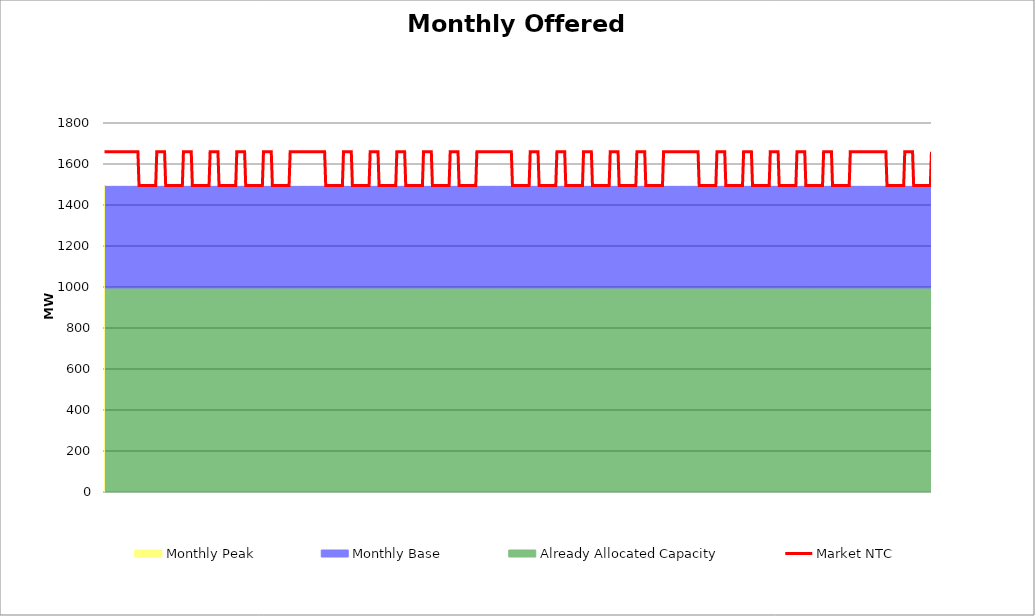
| Category | Market NTC |
|---|---|
| 0 | 1660 |
| 1 | 1660 |
| 2 | 1660 |
| 3 | 1660 |
| 4 | 1660 |
| 5 | 1660 |
| 6 | 1660 |
| 7 | 1660 |
| 8 | 1660 |
| 9 | 1660 |
| 10 | 1660 |
| 11 | 1660 |
| 12 | 1660 |
| 13 | 1660 |
| 14 | 1660 |
| 15 | 1660 |
| 16 | 1660 |
| 17 | 1660 |
| 18 | 1660 |
| 19 | 1660 |
| 20 | 1660 |
| 21 | 1660 |
| 22 | 1660 |
| 23 | 1660 |
| 24 | 1660 |
| 25 | 1660 |
| 26 | 1660 |
| 27 | 1660 |
| 28 | 1660 |
| 29 | 1660 |
| 30 | 1660 |
| 31 | 1495 |
| 32 | 1495 |
| 33 | 1495 |
| 34 | 1495 |
| 35 | 1495 |
| 36 | 1495 |
| 37 | 1495 |
| 38 | 1495 |
| 39 | 1495 |
| 40 | 1495 |
| 41 | 1495 |
| 42 | 1495 |
| 43 | 1495 |
| 44 | 1495 |
| 45 | 1495 |
| 46 | 1495 |
| 47 | 1660 |
| 48 | 1660 |
| 49 | 1660 |
| 50 | 1660 |
| 51 | 1660 |
| 52 | 1660 |
| 53 | 1660 |
| 54 | 1660 |
| 55 | 1495 |
| 56 | 1495 |
| 57 | 1495 |
| 58 | 1495 |
| 59 | 1495 |
| 60 | 1495 |
| 61 | 1495 |
| 62 | 1495 |
| 63 | 1495 |
| 64 | 1495 |
| 65 | 1495 |
| 66 | 1495 |
| 67 | 1495 |
| 68 | 1495 |
| 69 | 1495 |
| 70 | 1495 |
| 71 | 1660 |
| 72 | 1660 |
| 73 | 1660 |
| 74 | 1660 |
| 75 | 1660 |
| 76 | 1660 |
| 77 | 1660 |
| 78 | 1660 |
| 79 | 1495 |
| 80 | 1495 |
| 81 | 1495 |
| 82 | 1495 |
| 83 | 1495 |
| 84 | 1495 |
| 85 | 1495 |
| 86 | 1495 |
| 87 | 1495 |
| 88 | 1495 |
| 89 | 1495 |
| 90 | 1495 |
| 91 | 1495 |
| 92 | 1495 |
| 93 | 1495 |
| 94 | 1495 |
| 95 | 1660 |
| 96 | 1660 |
| 97 | 1660 |
| 98 | 1660 |
| 99 | 1660 |
| 100 | 1660 |
| 101 | 1660 |
| 102 | 1660 |
| 103 | 1495 |
| 104 | 1495 |
| 105 | 1495 |
| 106 | 1495 |
| 107 | 1495 |
| 108 | 1495 |
| 109 | 1495 |
| 110 | 1495 |
| 111 | 1495 |
| 112 | 1495 |
| 113 | 1495 |
| 114 | 1495 |
| 115 | 1495 |
| 116 | 1495 |
| 117 | 1495 |
| 118 | 1495 |
| 119 | 1660 |
| 120 | 1660 |
| 121 | 1660 |
| 122 | 1660 |
| 123 | 1660 |
| 124 | 1660 |
| 125 | 1660 |
| 126 | 1660 |
| 127 | 1495 |
| 128 | 1495 |
| 129 | 1495 |
| 130 | 1495 |
| 131 | 1495 |
| 132 | 1495 |
| 133 | 1495 |
| 134 | 1495 |
| 135 | 1495 |
| 136 | 1495 |
| 137 | 1495 |
| 138 | 1495 |
| 139 | 1495 |
| 140 | 1495 |
| 141 | 1495 |
| 142 | 1495 |
| 143 | 1660 |
| 144 | 1660 |
| 145 | 1660 |
| 146 | 1660 |
| 147 | 1660 |
| 148 | 1660 |
| 149 | 1660 |
| 150 | 1660 |
| 151 | 1495 |
| 152 | 1495 |
| 153 | 1495 |
| 154 | 1495 |
| 155 | 1495 |
| 156 | 1495 |
| 157 | 1495 |
| 158 | 1495 |
| 159 | 1495 |
| 160 | 1495 |
| 161 | 1495 |
| 162 | 1495 |
| 163 | 1495 |
| 164 | 1495 |
| 165 | 1495 |
| 166 | 1495 |
| 167 | 1660 |
| 168 | 1660 |
| 169 | 1660 |
| 170 | 1660 |
| 171 | 1660 |
| 172 | 1660 |
| 173 | 1660 |
| 174 | 1660 |
| 175 | 1660 |
| 176 | 1660 |
| 177 | 1660 |
| 178 | 1660 |
| 179 | 1660 |
| 180 | 1660 |
| 181 | 1660 |
| 182 | 1660 |
| 183 | 1660 |
| 184 | 1660 |
| 185 | 1660 |
| 186 | 1660 |
| 187 | 1660 |
| 188 | 1660 |
| 189 | 1660 |
| 190 | 1660 |
| 191 | 1660 |
| 192 | 1660 |
| 193 | 1660 |
| 194 | 1660 |
| 195 | 1660 |
| 196 | 1660 |
| 197 | 1660 |
| 198 | 1660 |
| 199 | 1495 |
| 200 | 1495 |
| 201 | 1495 |
| 202 | 1495 |
| 203 | 1495 |
| 204 | 1495 |
| 205 | 1495 |
| 206 | 1495 |
| 207 | 1495 |
| 208 | 1495 |
| 209 | 1495 |
| 210 | 1495 |
| 211 | 1495 |
| 212 | 1495 |
| 213 | 1495 |
| 214 | 1495 |
| 215 | 1660 |
| 216 | 1660 |
| 217 | 1660 |
| 218 | 1660 |
| 219 | 1660 |
| 220 | 1660 |
| 221 | 1660 |
| 222 | 1660 |
| 223 | 1495 |
| 224 | 1495 |
| 225 | 1495 |
| 226 | 1495 |
| 227 | 1495 |
| 228 | 1495 |
| 229 | 1495 |
| 230 | 1495 |
| 231 | 1495 |
| 232 | 1495 |
| 233 | 1495 |
| 234 | 1495 |
| 235 | 1495 |
| 236 | 1495 |
| 237 | 1495 |
| 238 | 1495 |
| 239 | 1660 |
| 240 | 1660 |
| 241 | 1660 |
| 242 | 1660 |
| 243 | 1660 |
| 244 | 1660 |
| 245 | 1660 |
| 246 | 1660 |
| 247 | 1495 |
| 248 | 1495 |
| 249 | 1495 |
| 250 | 1495 |
| 251 | 1495 |
| 252 | 1495 |
| 253 | 1495 |
| 254 | 1495 |
| 255 | 1495 |
| 256 | 1495 |
| 257 | 1495 |
| 258 | 1495 |
| 259 | 1495 |
| 260 | 1495 |
| 261 | 1495 |
| 262 | 1495 |
| 263 | 1660 |
| 264 | 1660 |
| 265 | 1660 |
| 266 | 1660 |
| 267 | 1660 |
| 268 | 1660 |
| 269 | 1660 |
| 270 | 1660 |
| 271 | 1495 |
| 272 | 1495 |
| 273 | 1495 |
| 274 | 1495 |
| 275 | 1495 |
| 276 | 1495 |
| 277 | 1495 |
| 278 | 1495 |
| 279 | 1495 |
| 280 | 1495 |
| 281 | 1495 |
| 282 | 1495 |
| 283 | 1495 |
| 284 | 1495 |
| 285 | 1495 |
| 286 | 1495 |
| 287 | 1660 |
| 288 | 1660 |
| 289 | 1660 |
| 290 | 1660 |
| 291 | 1660 |
| 292 | 1660 |
| 293 | 1660 |
| 294 | 1660 |
| 295 | 1495 |
| 296 | 1495 |
| 297 | 1495 |
| 298 | 1495 |
| 299 | 1495 |
| 300 | 1495 |
| 301 | 1495 |
| 302 | 1495 |
| 303 | 1495 |
| 304 | 1495 |
| 305 | 1495 |
| 306 | 1495 |
| 307 | 1495 |
| 308 | 1495 |
| 309 | 1495 |
| 310 | 1495 |
| 311 | 1660 |
| 312 | 1660 |
| 313 | 1660 |
| 314 | 1660 |
| 315 | 1660 |
| 316 | 1660 |
| 317 | 1660 |
| 318 | 1660 |
| 319 | 1495 |
| 320 | 1495 |
| 321 | 1495 |
| 322 | 1495 |
| 323 | 1495 |
| 324 | 1495 |
| 325 | 1495 |
| 326 | 1495 |
| 327 | 1495 |
| 328 | 1495 |
| 329 | 1495 |
| 330 | 1495 |
| 331 | 1495 |
| 332 | 1495 |
| 333 | 1495 |
| 334 | 1495 |
| 335 | 1660 |
| 336 | 1660 |
| 337 | 1660 |
| 338 | 1660 |
| 339 | 1660 |
| 340 | 1660 |
| 341 | 1660 |
| 342 | 1660 |
| 343 | 1660 |
| 344 | 1660 |
| 345 | 1660 |
| 346 | 1660 |
| 347 | 1660 |
| 348 | 1660 |
| 349 | 1660 |
| 350 | 1660 |
| 351 | 1660 |
| 352 | 1660 |
| 353 | 1660 |
| 354 | 1660 |
| 355 | 1660 |
| 356 | 1660 |
| 357 | 1660 |
| 358 | 1660 |
| 359 | 1660 |
| 360 | 1660 |
| 361 | 1660 |
| 362 | 1660 |
| 363 | 1660 |
| 364 | 1660 |
| 365 | 1660 |
| 366 | 1660 |
| 367 | 1495 |
| 368 | 1495 |
| 369 | 1495 |
| 370 | 1495 |
| 371 | 1495 |
| 372 | 1495 |
| 373 | 1495 |
| 374 | 1495 |
| 375 | 1495 |
| 376 | 1495 |
| 377 | 1495 |
| 378 | 1495 |
| 379 | 1495 |
| 380 | 1495 |
| 381 | 1495 |
| 382 | 1495 |
| 383 | 1660 |
| 384 | 1660 |
| 385 | 1660 |
| 386 | 1660 |
| 387 | 1660 |
| 388 | 1660 |
| 389 | 1660 |
| 390 | 1660 |
| 391 | 1495 |
| 392 | 1495 |
| 393 | 1495 |
| 394 | 1495 |
| 395 | 1495 |
| 396 | 1495 |
| 397 | 1495 |
| 398 | 1495 |
| 399 | 1495 |
| 400 | 1495 |
| 401 | 1495 |
| 402 | 1495 |
| 403 | 1495 |
| 404 | 1495 |
| 405 | 1495 |
| 406 | 1495 |
| 407 | 1660 |
| 408 | 1660 |
| 409 | 1660 |
| 410 | 1660 |
| 411 | 1660 |
| 412 | 1660 |
| 413 | 1660 |
| 414 | 1660 |
| 415 | 1495 |
| 416 | 1495 |
| 417 | 1495 |
| 418 | 1495 |
| 419 | 1495 |
| 420 | 1495 |
| 421 | 1495 |
| 422 | 1495 |
| 423 | 1495 |
| 424 | 1495 |
| 425 | 1495 |
| 426 | 1495 |
| 427 | 1495 |
| 428 | 1495 |
| 429 | 1495 |
| 430 | 1495 |
| 431 | 1660 |
| 432 | 1660 |
| 433 | 1660 |
| 434 | 1660 |
| 435 | 1660 |
| 436 | 1660 |
| 437 | 1660 |
| 438 | 1660 |
| 439 | 1495 |
| 440 | 1495 |
| 441 | 1495 |
| 442 | 1495 |
| 443 | 1495 |
| 444 | 1495 |
| 445 | 1495 |
| 446 | 1495 |
| 447 | 1495 |
| 448 | 1495 |
| 449 | 1495 |
| 450 | 1495 |
| 451 | 1495 |
| 452 | 1495 |
| 453 | 1495 |
| 454 | 1495 |
| 455 | 1660 |
| 456 | 1660 |
| 457 | 1660 |
| 458 | 1660 |
| 459 | 1660 |
| 460 | 1660 |
| 461 | 1660 |
| 462 | 1660 |
| 463 | 1495 |
| 464 | 1495 |
| 465 | 1495 |
| 466 | 1495 |
| 467 | 1495 |
| 468 | 1495 |
| 469 | 1495 |
| 470 | 1495 |
| 471 | 1495 |
| 472 | 1495 |
| 473 | 1495 |
| 474 | 1495 |
| 475 | 1495 |
| 476 | 1495 |
| 477 | 1495 |
| 478 | 1495 |
| 479 | 1660 |
| 480 | 1660 |
| 481 | 1660 |
| 482 | 1660 |
| 483 | 1660 |
| 484 | 1660 |
| 485 | 1660 |
| 486 | 1660 |
| 487 | 1495 |
| 488 | 1495 |
| 489 | 1495 |
| 490 | 1495 |
| 491 | 1495 |
| 492 | 1495 |
| 493 | 1495 |
| 494 | 1495 |
| 495 | 1495 |
| 496 | 1495 |
| 497 | 1495 |
| 498 | 1495 |
| 499 | 1495 |
| 500 | 1495 |
| 501 | 1495 |
| 502 | 1495 |
| 503 | 1660 |
| 504 | 1660 |
| 505 | 1660 |
| 506 | 1660 |
| 507 | 1660 |
| 508 | 1660 |
| 509 | 1660 |
| 510 | 1660 |
| 511 | 1660 |
| 512 | 1660 |
| 513 | 1660 |
| 514 | 1660 |
| 515 | 1660 |
| 516 | 1660 |
| 517 | 1660 |
| 518 | 1660 |
| 519 | 1660 |
| 520 | 1660 |
| 521 | 1660 |
| 522 | 1660 |
| 523 | 1660 |
| 524 | 1660 |
| 525 | 1660 |
| 526 | 1660 |
| 527 | 1660 |
| 528 | 1660 |
| 529 | 1660 |
| 530 | 1660 |
| 531 | 1660 |
| 532 | 1660 |
| 533 | 1660 |
| 534 | 1660 |
| 535 | 1495 |
| 536 | 1495 |
| 537 | 1495 |
| 538 | 1495 |
| 539 | 1495 |
| 540 | 1495 |
| 541 | 1495 |
| 542 | 1495 |
| 543 | 1495 |
| 544 | 1495 |
| 545 | 1495 |
| 546 | 1495 |
| 547 | 1495 |
| 548 | 1495 |
| 549 | 1495 |
| 550 | 1495 |
| 551 | 1660 |
| 552 | 1660 |
| 553 | 1660 |
| 554 | 1660 |
| 555 | 1660 |
| 556 | 1660 |
| 557 | 1660 |
| 558 | 1660 |
| 559 | 1495 |
| 560 | 1495 |
| 561 | 1495 |
| 562 | 1495 |
| 563 | 1495 |
| 564 | 1495 |
| 565 | 1495 |
| 566 | 1495 |
| 567 | 1495 |
| 568 | 1495 |
| 569 | 1495 |
| 570 | 1495 |
| 571 | 1495 |
| 572 | 1495 |
| 573 | 1495 |
| 574 | 1495 |
| 575 | 1660 |
| 576 | 1660 |
| 577 | 1660 |
| 578 | 1660 |
| 579 | 1660 |
| 580 | 1660 |
| 581 | 1660 |
| 582 | 1660 |
| 583 | 1495 |
| 584 | 1495 |
| 585 | 1495 |
| 586 | 1495 |
| 587 | 1495 |
| 588 | 1495 |
| 589 | 1495 |
| 590 | 1495 |
| 591 | 1495 |
| 592 | 1495 |
| 593 | 1495 |
| 594 | 1495 |
| 595 | 1495 |
| 596 | 1495 |
| 597 | 1495 |
| 598 | 1495 |
| 599 | 1660 |
| 600 | 1660 |
| 601 | 1660 |
| 602 | 1660 |
| 603 | 1660 |
| 604 | 1660 |
| 605 | 1660 |
| 606 | 1660 |
| 607 | 1495 |
| 608 | 1495 |
| 609 | 1495 |
| 610 | 1495 |
| 611 | 1495 |
| 612 | 1495 |
| 613 | 1495 |
| 614 | 1495 |
| 615 | 1495 |
| 616 | 1495 |
| 617 | 1495 |
| 618 | 1495 |
| 619 | 1495 |
| 620 | 1495 |
| 621 | 1495 |
| 622 | 1495 |
| 623 | 1660 |
| 624 | 1660 |
| 625 | 1660 |
| 626 | 1660 |
| 627 | 1660 |
| 628 | 1660 |
| 629 | 1660 |
| 630 | 1660 |
| 631 | 1495 |
| 632 | 1495 |
| 633 | 1495 |
| 634 | 1495 |
| 635 | 1495 |
| 636 | 1495 |
| 637 | 1495 |
| 638 | 1495 |
| 639 | 1495 |
| 640 | 1495 |
| 641 | 1495 |
| 642 | 1495 |
| 643 | 1495 |
| 644 | 1495 |
| 645 | 1495 |
| 646 | 1495 |
| 647 | 1660 |
| 648 | 1660 |
| 649 | 1660 |
| 650 | 1660 |
| 651 | 1660 |
| 652 | 1660 |
| 653 | 1660 |
| 654 | 1660 |
| 655 | 1495 |
| 656 | 1495 |
| 657 | 1495 |
| 658 | 1495 |
| 659 | 1495 |
| 660 | 1495 |
| 661 | 1495 |
| 662 | 1495 |
| 663 | 1495 |
| 664 | 1495 |
| 665 | 1495 |
| 666 | 1495 |
| 667 | 1495 |
| 668 | 1495 |
| 669 | 1495 |
| 670 | 1495 |
| 671 | 1660 |
| 672 | 1660 |
| 673 | 1660 |
| 674 | 1660 |
| 675 | 1660 |
| 676 | 1660 |
| 677 | 1660 |
| 678 | 1660 |
| 679 | 1660 |
| 680 | 1660 |
| 681 | 1660 |
| 682 | 1660 |
| 683 | 1660 |
| 684 | 1660 |
| 685 | 1660 |
| 686 | 1660 |
| 687 | 1660 |
| 688 | 1660 |
| 689 | 1660 |
| 690 | 1660 |
| 691 | 1660 |
| 692 | 1660 |
| 693 | 1660 |
| 694 | 1660 |
| 695 | 1660 |
| 696 | 1660 |
| 697 | 1660 |
| 698 | 1660 |
| 699 | 1660 |
| 700 | 1660 |
| 701 | 1660 |
| 702 | 1660 |
| 703 | 1660 |
| 704 | 1495 |
| 705 | 1495 |
| 706 | 1495 |
| 707 | 1495 |
| 708 | 1495 |
| 709 | 1495 |
| 710 | 1495 |
| 711 | 1495 |
| 712 | 1495 |
| 713 | 1495 |
| 714 | 1495 |
| 715 | 1495 |
| 716 | 1495 |
| 717 | 1495 |
| 718 | 1495 |
| 719 | 1495 |
| 720 | 1660 |
| 721 | 1660 |
| 722 | 1660 |
| 723 | 1660 |
| 724 | 1660 |
| 725 | 1660 |
| 726 | 1660 |
| 727 | 1660 |
| 728 | 1495 |
| 729 | 1495 |
| 730 | 1495 |
| 731 | 1495 |
| 732 | 1495 |
| 733 | 1495 |
| 734 | 1495 |
| 735 | 1495 |
| 736 | 1495 |
| 737 | 1495 |
| 738 | 1495 |
| 739 | 1495 |
| 740 | 1495 |
| 741 | 1495 |
| 742 | 1495 |
| 743 | 1495 |
| 744 | 1660 |